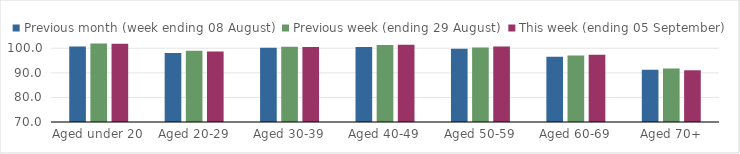
| Category | Previous month (week ending 08 August) | Previous week (ending 29 August) | This week (ending 05 September) |
|---|---|---|---|
| Aged under 20 | 100.75 | 101.91 | 101.81 |
| Aged 20-29 | 98.12 | 98.98 | 98.7 |
| Aged 30-39 | 100.17 | 100.63 | 100.57 |
| Aged 40-49 | 100.56 | 101.3 | 101.42 |
| Aged 50-59 | 99.82 | 100.36 | 100.68 |
| Aged 60-69 | 96.52 | 97.08 | 97.41 |
| Aged 70+ | 91.27 | 91.81 | 91.05 |